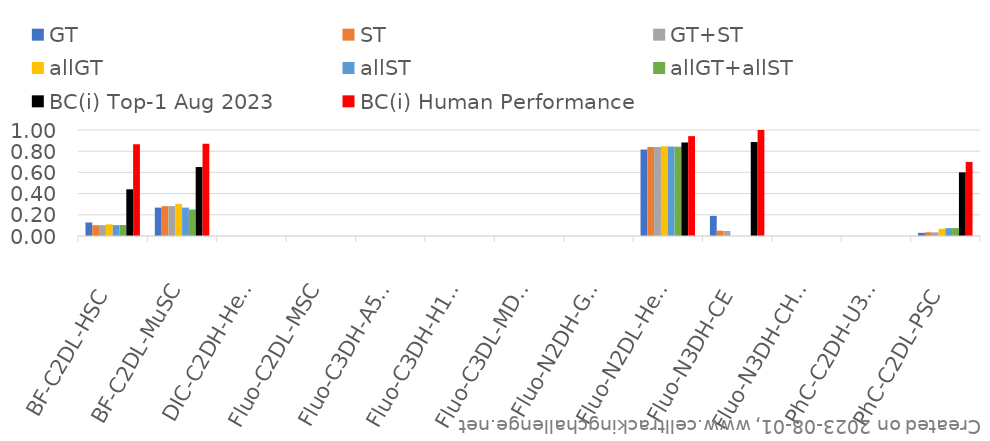
| Category | GT | ST | GT+ST | allGT | allST | allGT+allST | BC(i) Top-1 Aug 2023 | BC(i) Human Performance |
|---|---|---|---|---|---|---|---|---|
| BF-C2DL-HSC | 0.127 | 0.102 | 0.102 | 0.111 | 0.102 | 0.104 | 0.44 | 0.866 |
| BF-C2DL-MuSC | 0.268 | 0.282 | 0.282 | 0.302 | 0.268 | 0.25 | 0.651 | 0.87 |
| DIC-C2DH-HeLa | 0 | 0 | 0 | 0 | 0 | 0 | 0 | 0 |
| Fluo-C2DL-MSC | 0 | 0 | 0 | 0 | 0 | 0 | 0 | 0 |
| Fluo-C3DH-A549 | 0 | 0 | 0 | 0 | 0 | 0 | 0 | 0 |
| Fluo-C3DH-H157 | 0 | 0 | 0 | 0 | 0 | 0 | 0 | 0 |
| Fluo-C3DL-MDA231 | 0 | 0 | 0 | 0 | 0 | 0 | 0 | 0 |
| Fluo-N2DH-GOWT1 | 0 | 0 | 0 | 0 | 0 | 0 | 0 | 0 |
| Fluo-N2DL-HeLa | 0.816 | 0.84 | 0.84 | 0.846 | 0.844 | 0.842 | 0.882 | 0.942 |
| Fluo-N3DH-CE | 0.19 | 0.05 | 0.047 | 0 | 0 | 0 | 0.887 | 1 |
| Fluo-N3DH-CHO | 0 | 0 | 0 | 0 | 0 | 0 | 0 | 0 |
| PhC-C2DH-U373 | 0 | 0 | 0 | 0 | 0 | 0 | 0 | 0 |
| PhC-C2DL-PSC | 0.03 | 0.035 | 0.034 | 0.068 | 0.074 | 0.075 | 0.6 | 0.699 |